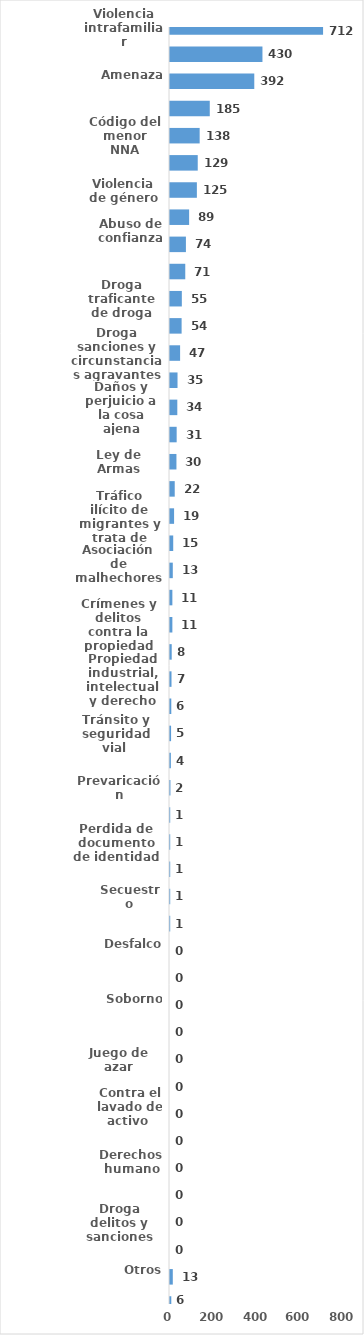
| Category | Series 0 |
|---|---|
| Violencia intrafamiliar | 712 |
| Robo calificado | 430 |
| Amenaza | 392 |
| Golpes y heridas | 185 |
| Código del menor NNA | 138 |
| Droga simple posesión | 129 |
| Violencia de género | 125 |
| Droga distribución de droga | 89 |
| Abuso de confianza | 74 |
| Crímenes y delitos de alta tecnología | 71 |
| Droga traficante de droga | 55 |
| Agresión sexual | 54 |
| Droga sanciones y circunstancias agravantes | 47 |
| Código del trabajo | 35 |
| Daños y perjuicio a la cosa ajena | 34 |
| Estafa | 31 |
| Ley de Armas | 30 |
| Robo simple | 22 |
| Tráfico ilícito de migrantes y trata de personas | 19 |
| Protección Animal y Tenencia Responsable | 15 |
| Asociación de malhechores | 13 |
| Homicidio | 11 |
| Crímenes y delitos contra la propiedad | 11 |
| Tentativa de homicidio | 8 |
| Propiedad industrial, intelectual y derecho de autor | 7 |
| Violación sexual | 6 |
| Tránsito y seguridad vial  | 5 |
| Falsificación | 4 |
| Prevaricación | 2 |
| Difamación e injuria | 1 |
| Perdida de documento de identidad | 1 |
| Desaparición | 1 |
| Secuestro | 1 |
| Ley de cheque | 1 |
| Desfalco | 0 |
| Conflictos sociales | 0 |
| Soborno | 0 |
| Medio ambiente y recursos naturales | 0 |
| Juego de azar | 0 |
| Ley general de salud | 0 |
| Contra el lavado de activo  | 0 |
| Proxeneta | 0 |
| Derechos humano | 0 |
| Terrorismo | 0 |
| Droga delitos y sanciones | 0 |
| Aborto y tentativa | 0 |
| Otros | 13 |
| Indeterminados | 6 |